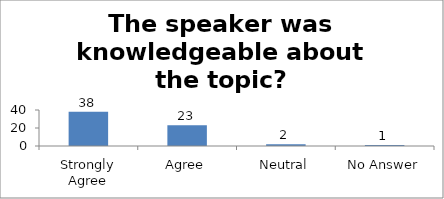
| Category | The speaker was knowledgeable about the topic? |
|---|---|
| Strongly Agree | 38 |
| Agree | 23 |
| Neutral | 2 |
| No Answer | 1 |